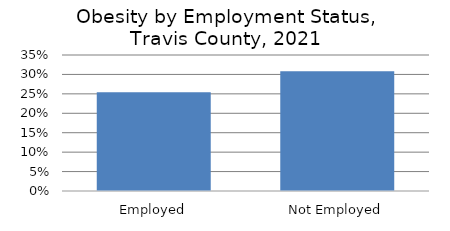
| Category | Series 0 |
|---|---|
| Employed | 0.254 |
| Not Employed | 0.308 |